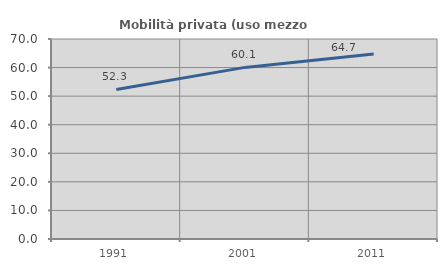
| Category | Mobilità privata (uso mezzo privato) |
|---|---|
| 1991.0 | 52.346 |
| 2001.0 | 60.061 |
| 2011.0 | 64.715 |